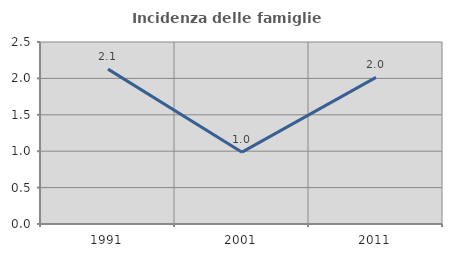
| Category | Incidenza delle famiglie numerose |
|---|---|
| 1991.0 | 2.128 |
| 2001.0 | 0.987 |
| 2011.0 | 2.013 |